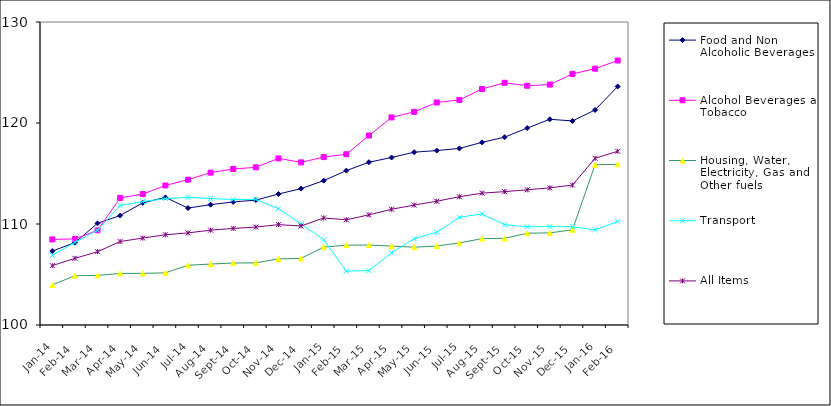
| Category | Food and Non Alcoholic Beverages | Alcohol Beverages and Tobacco | Housing, Water, Electricity, Gas and Other fuels | Transport | All Items  |
|---|---|---|---|---|---|
| 2014-01-01 | 107.321 | 108.474 | 103.967 | 106.895 | 105.878 |
| 2014-02-01 | 108.156 | 108.519 | 104.883 | 108.18 | 106.601 |
| 2014-03-01 | 110.07 | 109.373 | 104.905 | 109.388 | 107.257 |
| 2014-04-01 | 110.836 | 112.583 | 105.106 | 111.837 | 108.264 |
| 2014-05-01 | 112.095 | 112.965 | 105.114 | 112.218 | 108.608 |
| 2014-06-01 | 112.634 | 113.813 | 105.162 | 112.502 | 108.936 |
| 2014-07-01 | 111.577 | 114.387 | 105.914 | 112.638 | 109.117 |
| 2014-08-01 | 111.915 | 115.087 | 106.036 | 112.525 | 109.391 |
| 2014-09-01 | 112.185 | 115.445 | 106.136 | 112.42 | 109.563 |
| 2014-10-01 | 112.363 | 115.614 | 106.151 | 112.444 | 109.694 |
| 2014-11-01 | 112.971 | 116.497 | 106.547 | 111.515 | 109.94 |
| 2014-12-01 | 113.5 | 116.1 | 106.6 | 110 | 109.8 |
| 2015-01-01 | 114.295 | 116.625 | 107.716 | 108.446 | 110.601 |
| 2015-02-01 | 115.283 | 116.906 | 107.901 | 105.333 | 110.415 |
| 2015-03-01 | 116.12 | 118.76 | 107.917 | 105.386 | 110.906 |
| 2015-04-01 | 116.582 | 120.552 | 107.812 | 107.146 | 111.458 |
| 2015-05-01 | 117.112 | 121.107 | 107.704 | 108.548 | 111.873 |
| 2015-06-01 | 117.271 | 122.03 | 107.821 | 109.182 | 112.254 |
| 2015-07-01 | 117.484 | 122.282 | 108.124 | 110.66 | 112.699 |
| 2015-08-01 | 118.084 | 123.363 | 108.552 | 111 | 113.056 |
| 2015-09-01 | 118.596 | 123.979 | 108.577 | 109.926 | 113.205 |
| 2015-10-01 | 119.501 | 123.689 | 109.085 | 109.721 | 113.387 |
| 2015-11-01 | 120.368 | 123.804 | 109.122 | 109.744 | 113.581 |
| 2015-12-01 | 120.205 | 124.86 | 109.423 | 109.727 | 113.852 |
| 2016-01-01 | 121.29 | 125.378 | 115.867 | 109.421 | 116.507 |
| 2016-02-01 | 123.619 | 126.187 | 115.907 | 110.251 | 117.2 |